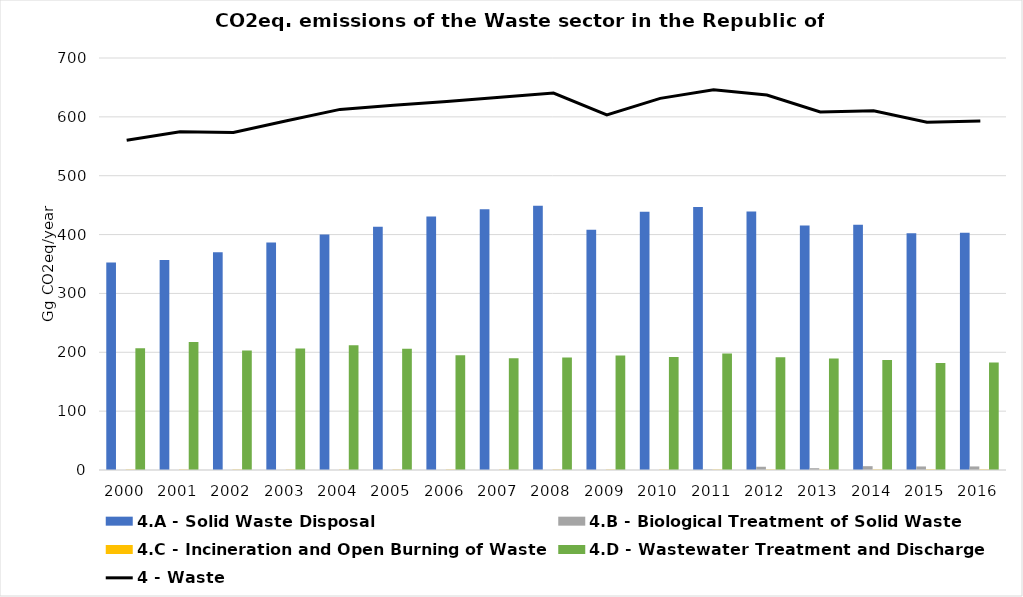
| Category | 4.A - Solid Waste Disposal | 4.B - Biological Treatment of Solid Waste | 4.C - Incineration and Open Burning of Waste | 4.D - Wastewater Treatment and Discharge |
|---|---|---|---|---|
| 0 | 352.645 | 0 | 0.564 | 207.039 |
| 1 | 356.954 | 0 | 0.552 | 217.299 |
| 2 | 370.035 | 0 | 0.559 | 202.982 |
| 3 | 386.472 | 0 | 0.519 | 206.25 |
| 4 | 400.095 | 0 | 0.523 | 212.048 |
| 5 | 413.28 | 0 | 0.523 | 205.895 |
| 6 | 430.848 | 0 | 0.548 | 194.84 |
| 7 | 442.98 | 0 | 0.529 | 189.938 |
| 8 | 448.914 | 0 | 0.538 | 191.095 |
| 9 | 408.19 | 0 | 0.518 | 194.44 |
| 10 | 438.717 | 0 | 0.527 | 192.194 |
| 11 | 446.709 | 0.816 | 0.568 | 198.031 |
| 12 | 439.18 | 5.51 | 0.568 | 191.775 |
| 13 | 415.53 | 3.05 | 0.588 | 189.28 |
| 14 | 416.496 | 6.499 | 0.663 | 186.689 |
| 15 | 402.215 | 6.016 | 0.739 | 181.765 |
| 16 | 403.304 | 6.068 | 0.74 | 182.698 |